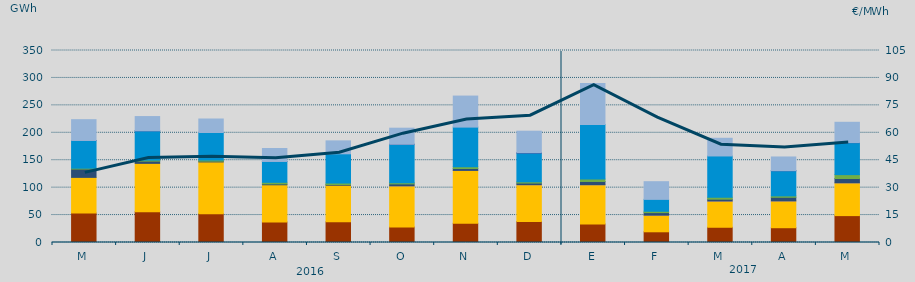
| Category | Carbón | Ciclo Combinado | Cogeneración | Consumo Bombeo | Eólica | Hidráulica | Nuclear | Turbinación bombeo |
|---|---|---|---|---|---|---|---|---|
| M | 53629.9 | 65079.6 | 0 | 15177.5 | 1551.4 | 50504.5 | 57 | 37889.8 |
| J | 56105.7 | 88155 | 0 | 4098 | 1765.6 | 53472.5 | 75 | 25898.4 |
| J | 52336 | 94541.2 | 0 | 1399.6 | 1952.7 | 50314 | 0 | 24575.3 |
| A | 37334.5 | 67871 | 0 | 1577.6 | 2939.5 | 37964.3 | 25 | 23687.2 |
| S | 37698.5 | 66682.3 | 0 | 1355 | 2661.1 | 53272.9 | 0 | 23588.2 |
| O | 28157.6 | 75179.9 | 2.2 | 3499.1 | 2164.7 | 70061.5 | 21.9 | 29280.6 |
| N | 34938.5 | 96462 | 10.5 | 3432.1 | 3197.2 | 72313.8 | 0 | 56573.1 |
| D | 38367.5 | 66989.6 | 22.7 | 3010.5 | 2208.6 | 52585.3 | 619.5 | 39099.8 |
| E | 33693.8 | 71645.3 | 16.3 | 5899.1 | 4288.7 | 99664.7 | 0 | 74414.2 |
| F | 19518.4 | 30319.3 | 9.6 | 4595.7 | 2486.3 | 21689.9 | 0 | 32220.5 |
| M | 27782.8 | 47861.9 | 30.1 | 3279.6 | 3494.1 | 75296.7 | 0 | 32248 |
| A | 26944.8 | 48899.3 | 13.6 | 6553.1 | 2541.5 | 45882.6 | 122 | 24942.1 |
| M | 49018.7 | 59814.3 | 7.3 | 7845.9 | 7018.8 | 58284.6 | 169.5 | 36979 |